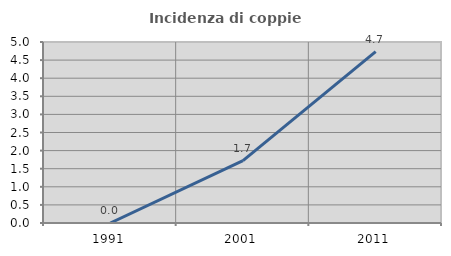
| Category | Incidenza di coppie miste |
|---|---|
| 1991.0 | 0 |
| 2001.0 | 1.724 |
| 2011.0 | 4.735 |